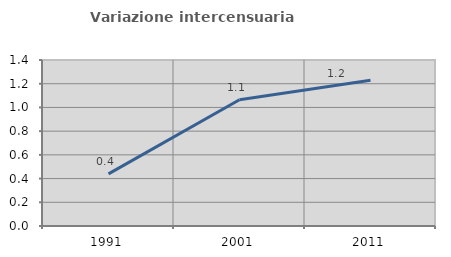
| Category | Variazione intercensuaria annua |
|---|---|
| 1991.0 | 0.44 |
| 2001.0 | 1.065 |
| 2011.0 | 1.229 |